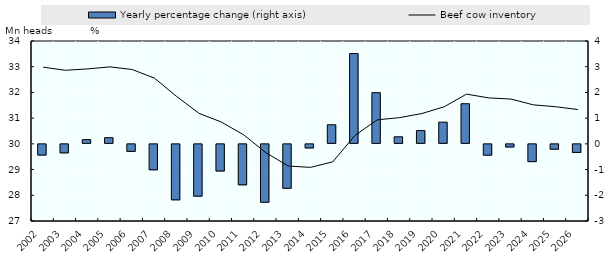
| Category | Yearly percentage change (right axis) |
|---|---|
| 2002.0 | -0.456 |
| 2003.0 | -0.37 |
| 2004.0 | 0.164 |
| 2005.0 | 0.24 |
| 2006.0 | -0.312 |
| 2007.0 | -1.028 |
| 2008.0 | -2.196 |
| 2009.0 | -2.054 |
| 2010.0 | -1.075 |
| 2011.0 | -1.613 |
| 2012.0 | -2.291 |
| 2013.0 | -1.747 |
| 2014.0 | -0.178 |
| 2015.0 | 0.744 |
| 2016.0 | 3.511 |
| 2017.0 | 1.991 |
| 2018.0 | 0.274 |
| 2019.0 | 0.516 |
| 2020.0 | 0.844 |
| 2021.0 | 1.561 |
| 2022.0 | -0.459 |
| 2023.0 | -0.141 |
| 2024.0 | -0.71 |
| 2025.0 | -0.228 |
| 2026.0 | -0.353 |